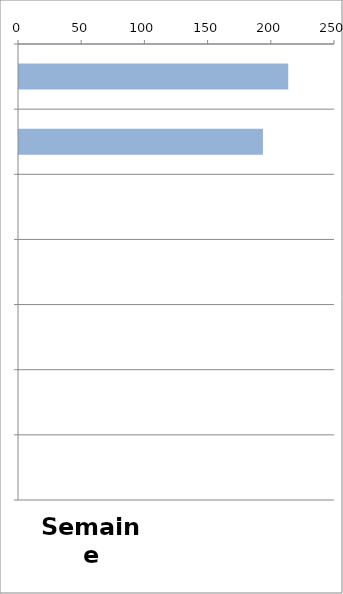
| Category | TV |
|---|---|
| 0 | 213 |
| 1 | 193 |
| 2 | 0 |
| 3 | 0 |
| 4 | 0 |
| 5 | 0 |
| 6 | 0 |